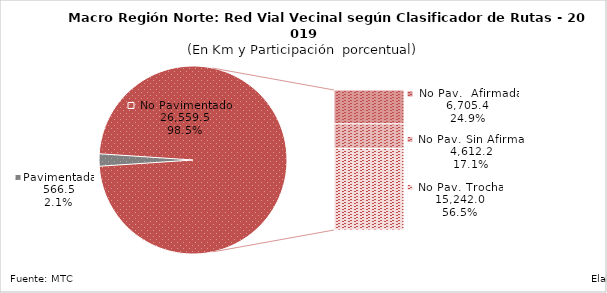
| Category | Series 0 |
|---|---|
| Pavimentada | 566.493 |
| No Pavimentada                   Afirmada | 6345.94 |
| No Pavimentada                   Sin Afirmar | 4577.149 |
| No Pavimentada                            Trocha | 15255.709 |